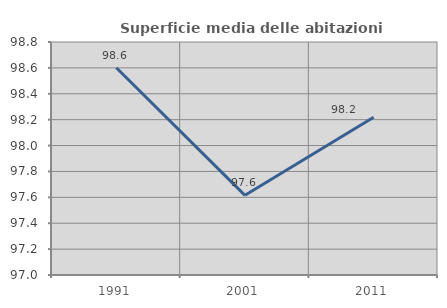
| Category | Superficie media delle abitazioni occupate |
|---|---|
| 1991.0 | 98.601 |
| 2001.0 | 97.615 |
| 2011.0 | 98.219 |